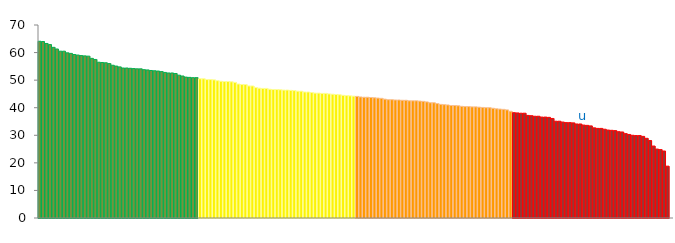
| Category | Top Quartile | 2nd Quartile | 3rd Quartile | Bottom Quartile | Series 4 |
|---|---|---|---|---|---|
|  | 64.1 | 0 | 0 | 0 | 64.1 |
|  | 64 | 0 | 0 | 0 | 64 |
|  | 63.3 | 0 | 0 | 0 | 63.3 |
|  | 62.9 | 0 | 0 | 0 | 62.9 |
|  | 61.9 | 0 | 0 | 0 | 61.9 |
|  | 61.3 | 0 | 0 | 0 | 61.3 |
|  | 60.5 | 0 | 0 | 0 | 60.5 |
|  | 60.5 | 0 | 0 | 0 | 60.5 |
|  | 59.9 | 0 | 0 | 0 | 59.9 |
|  | 59.7 | 0 | 0 | 0 | 59.7 |
|  | 59.3 | 0 | 0 | 0 | 59.3 |
|  | 59.1 | 0 | 0 | 0 | 59.1 |
|  | 58.9 | 0 | 0 | 0 | 58.9 |
|  | 58.8 | 0 | 0 | 0 | 58.8 |
|  | 58.7 | 0 | 0 | 0 | 58.7 |
|  | 57.9 | 0 | 0 | 0 | 57.9 |
|  | 57.5 | 0 | 0 | 0 | 57.5 |
|  | 56.5 | 0 | 0 | 0 | 56.5 |
|  | 56.4 | 0 | 0 | 0 | 56.4 |
|  | 56.3 | 0 | 0 | 0 | 56.3 |
|  | 56 | 0 | 0 | 0 | 56 |
|  | 55.4 | 0 | 0 | 0 | 55.4 |
|  | 55.1 | 0 | 0 | 0 | 55.1 |
|  | 54.8 | 0 | 0 | 0 | 54.8 |
|  | 54.4 | 0 | 0 | 0 | 54.4 |
|  | 54.4 | 0 | 0 | 0 | 54.4 |
|  | 54.3 | 0 | 0 | 0 | 54.3 |
|  | 54.2 | 0 | 0 | 0 | 54.2 |
|  | 54.1 | 0 | 0 | 0 | 54.1 |
|  | 54.1 | 0 | 0 | 0 | 54.1 |
|  | 53.8 | 0 | 0 | 0 | 53.8 |
|  | 53.7 | 0 | 0 | 0 | 53.7 |
|  | 53.5 | 0 | 0 | 0 | 53.5 |
|  | 53.4 | 0 | 0 | 0 | 53.4 |
|  | 53.3 | 0 | 0 | 0 | 53.3 |
|  | 53.1 | 0 | 0 | 0 | 53.1 |
|  | 52.8 | 0 | 0 | 0 | 52.8 |
|  | 52.6 | 0 | 0 | 0 | 52.6 |
|  | 52.6 | 0 | 0 | 0 | 52.6 |
|  | 52.4 | 0 | 0 | 0 | 52.4 |
|  | 51.8 | 0 | 0 | 0 | 51.8 |
|  | 51.5 | 0 | 0 | 0 | 51.5 |
|  | 51.1 | 0 | 0 | 0 | 51.1 |
|  | 51 | 0 | 0 | 0 | 51 |
|  | 50.9 | 0 | 0 | 0 | 50.9 |
|  | 50.9 | 0 | 0 | 0 | 50.9 |
|  | 0 | 50.5 | 0 | 0 | 50.5 |
|  | 0 | 50.5 | 0 | 0 | 50.5 |
|  | 0 | 50.2 | 0 | 0 | 50.2 |
|  | 0 | 50.2 | 0 | 0 | 50.2 |
|  | 0 | 50.1 | 0 | 0 | 50.1 |
|  | 0 | 49.8 | 0 | 0 | 49.8 |
|  | 0 | 49.6 | 0 | 0 | 49.6 |
|  | 0 | 49.5 | 0 | 0 | 49.5 |
|  | 0 | 49.5 | 0 | 0 | 49.5 |
|  | 0 | 49.4 | 0 | 0 | 49.4 |
|  | 0 | 49.2 | 0 | 0 | 49.2 |
|  | 0 | 48.6 | 0 | 0 | 48.6 |
|  | 0 | 48.4 | 0 | 0 | 48.4 |
|  | 0 | 48.4 | 0 | 0 | 48.4 |
|  | 0 | 47.9 | 0 | 0 | 47.9 |
|  | 0 | 47.9 | 0 | 0 | 47.9 |
|  | 0 | 47.3 | 0 | 0 | 47.3 |
|  | 0 | 47.1 | 0 | 0 | 47.1 |
|  | 0 | 47 | 0 | 0 | 47 |
|  | 0 | 47 | 0 | 0 | 47 |
|  | 0 | 46.7 | 0 | 0 | 46.7 |
|  | 0 | 46.6 | 0 | 0 | 46.6 |
|  | 0 | 46.6 | 0 | 0 | 46.6 |
|  | 0 | 46.5 | 0 | 0 | 46.5 |
|  | 0 | 46.4 | 0 | 0 | 46.4 |
|  | 0 | 46.4 | 0 | 0 | 46.4 |
|  | 0 | 46.3 | 0 | 0 | 46.3 |
|  | 0 | 46.2 | 0 | 0 | 46.2 |
|  | 0 | 46 | 0 | 0 | 46 |
|  | 0 | 46 | 0 | 0 | 46 |
|  | 0 | 45.7 | 0 | 0 | 45.7 |
|  | 0 | 45.7 | 0 | 0 | 45.7 |
|  | 0 | 45.5 | 0 | 0 | 45.5 |
|  | 0 | 45.3 | 0 | 0 | 45.3 |
|  | 0 | 45.3 | 0 | 0 | 45.3 |
|  | 0 | 45.2 | 0 | 0 | 45.2 |
|  | 0 | 45.2 | 0 | 0 | 45.2 |
|  | 0 | 45 | 0 | 0 | 45 |
|  | 0 | 44.9 | 0 | 0 | 44.9 |
|  | 0 | 44.8 | 0 | 0 | 44.8 |
|  | 0 | 44.7 | 0 | 0 | 44.7 |
|  | 0 | 44.5 | 0 | 0 | 44.5 |
|  | 0 | 44.4 | 0 | 0 | 44.4 |
|  | 0 | 44.3 | 0 | 0 | 44.3 |
|  | 0 | 44.2 | 0 | 0 | 44.2 |
|  | 0 | 0 | 44.1 | 0 | 44.1 |
|  | 0 | 0 | 43.9 | 0 | 43.9 |
|  | 0 | 0 | 43.8 | 0 | 43.8 |
|  | 0 | 0 | 43.8 | 0 | 43.8 |
|  | 0 | 0 | 43.7 | 0 | 43.7 |
|  | 0 | 0 | 43.6 | 0 | 43.6 |
|  | 0 | 0 | 43.5 | 0 | 43.5 |
|  | 0 | 0 | 43.4 | 0 | 43.4 |
|  | 0 | 0 | 43.1 | 0 | 43.1 |
|  | 0 | 0 | 42.9 | 0 | 42.9 |
|  | 0 | 0 | 42.9 | 0 | 42.9 |
|  | 0 | 0 | 42.8 | 0 | 42.8 |
|  | 0 | 0 | 42.8 | 0 | 42.8 |
|  | 0 | 0 | 42.7 | 0 | 42.7 |
|  | 0 | 0 | 42.7 | 0 | 42.7 |
|  | 0 | 0 | 42.5 | 0 | 42.5 |
|  | 0 | 0 | 42.5 | 0 | 42.5 |
|  | 0 | 0 | 42.5 | 0 | 42.5 |
|  | 0 | 0 | 42.4 | 0 | 42.4 |
|  | 0 | 0 | 42.3 | 0 | 42.3 |
|  | 0 | 0 | 42.1 | 0 | 42.1 |
|  | 0 | 0 | 41.8 | 0 | 41.8 |
|  | 0 | 0 | 41.8 | 0 | 41.8 |
|  | 0 | 0 | 41.5 | 0 | 41.5 |
|  | 0 | 0 | 41.2 | 0 | 41.2 |
|  | 0 | 0 | 41.1 | 0 | 41.1 |
|  | 0 | 0 | 41 | 0 | 41 |
|  | 0 | 0 | 40.8 | 0 | 40.8 |
|  | 0 | 0 | 40.8 | 0 | 40.8 |
|  | 0 | 0 | 40.7 | 0 | 40.7 |
|  | 0 | 0 | 40.5 | 0 | 40.5 |
|  | 0 | 0 | 40.4 | 0 | 40.4 |
|  | 0 | 0 | 40.4 | 0 | 40.4 |
|  | 0 | 0 | 40.3 | 0 | 40.3 |
|  | 0 | 0 | 40.3 | 0 | 40.3 |
|  | 0 | 0 | 40.2 | 0 | 40.2 |
|  | 0 | 0 | 40.1 | 0 | 40.1 |
|  | 0 | 0 | 40 | 0 | 40 |
|  | 0 | 0 | 40 | 0 | 40 |
|  | 0 | 0 | 39.8 | 0 | 39.8 |
|  | 0 | 0 | 39.6 | 0 | 39.6 |
|  | 0 | 0 | 39.5 | 0 | 39.5 |
|  | 0 | 0 | 39.4 | 0 | 39.4 |
|  | 0 | 0 | 39.2 | 0 | 39.2 |
|  | 0 | 0 | 38.7 | 0 | 38.7 |
|  | 0 | 0 | 0 | 38.2 | 38.2 |
|  | 0 | 0 | 0 | 38.1 | 38.1 |
|  | 0 | 0 | 0 | 38 | 38 |
|  | 0 | 0 | 0 | 38 | 38 |
|  | 0 | 0 | 0 | 37.2 | 37.2 |
|  | 0 | 0 | 0 | 37.1 | 37.1 |
|  | 0 | 0 | 0 | 36.9 | 36.9 |
|  | 0 | 0 | 0 | 36.9 | 36.9 |
|  | 0 | 0 | 0 | 36.6 | 36.6 |
|  | 0 | 0 | 0 | 36.6 | 36.6 |
|  | 0 | 0 | 0 | 36.5 | 36.5 |
|  | 0 | 0 | 0 | 36.1 | 36.1 |
|  | 0 | 0 | 0 | 35.1 | 35.1 |
|  | 0 | 0 | 0 | 35.1 | 35.1 |
|  | 0 | 0 | 0 | 34.8 | 34.8 |
|  | 0 | 0 | 0 | 34.6 | 34.6 |
|  | 0 | 0 | 0 | 34.6 | 34.6 |
|  | 0 | 0 | 0 | 34.5 | 34.5 |
|  | 0 | 0 | 0 | 34.1 | 34.1 |
|  | 0 | 0 | 0 | 34.1 | 34.1 |
| u | 0 | 0 | 0 | 33.7 | 33.7 |